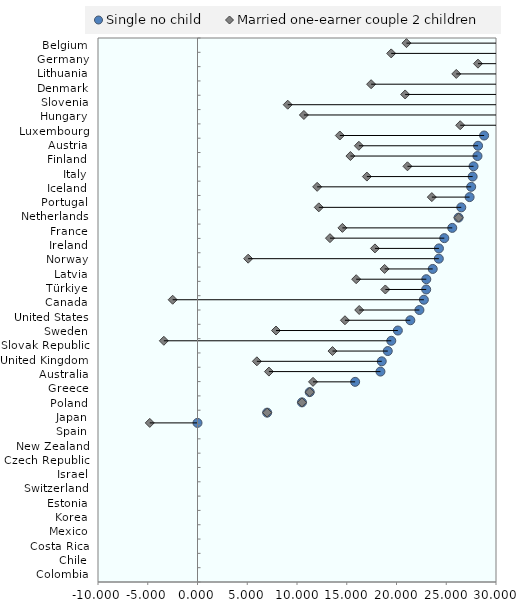
| Category | blankName |
|---|---|
| Colombia | -4.797 |
| Chile | 7 |
| Costa Rica | 10.5 |
| Mexico | 11.279 |
| Korea | 11.61 |
| Estonia | 7.178 |
| Switzerland | 5.967 |
| Israel | 13.568 |
| Czech Republic | -3.384 |
| New Zealand | 7.891 |
| Spain | 14.821 |
| Japan | 16.255 |
| Poland | -2.496 |
| Greece | 18.878 |
| Australia | 15.949 |
| United Kingdom | 18.805 |
| Slovak Republic | 5.091 |
| Sweden | 17.835 |
| United States | 13.314 |
| Canada | 14.564 |
| Türkiye | 26.238 |
| Latvia | 12.189 |
| Norway | 23.551 |
| Ireland | 12.026 |
| France | 17.024 |
| Netherlands | 21.102 |
| Portugal | 15.368 |
| Iceland | 16.218 |
| Italy | 14.303 |
| Finland | 26.403 |
| Austria | 10.693 |
| Luxembourg | 9.067 |
| Hungary | 20.871 |
| Slovenia | 17.45 |
| Denmark | 26.008 |
| Lithuania | 28.188 |
| Germany | 19.466 |
| Belgium | 21.002 |